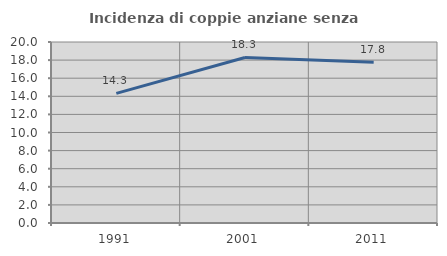
| Category | Incidenza di coppie anziane senza figli  |
|---|---|
| 1991.0 | 14.318 |
| 2001.0 | 18.293 |
| 2011.0 | 17.755 |